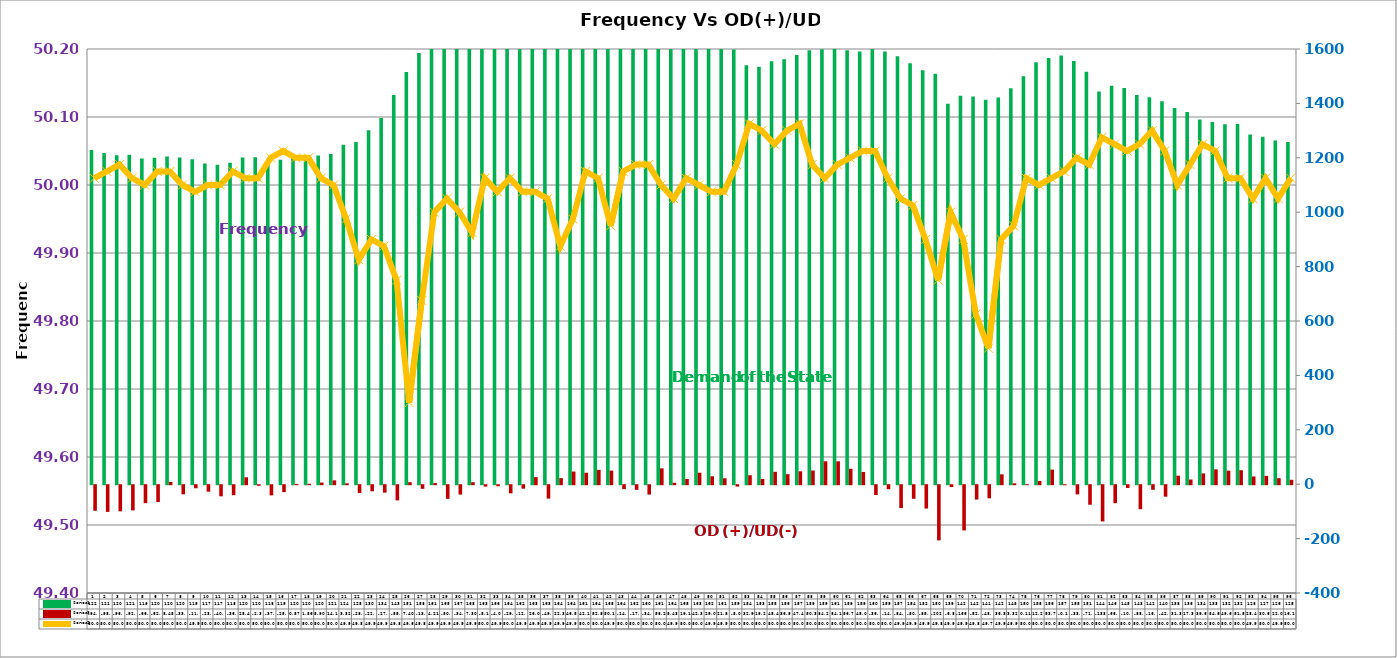
| Category | Series 2 | Series 4 |
|---|---|---|
| 0 | 1229 | -94.1 |
| 1 | 1218 | -98.186 |
| 2 | 1209 | -96.105 |
| 3 | 1211 | -92.636 |
| 4 | 1197 | -66.064 |
| 5 | 1200 | -62.064 |
| 6 | 1205 | 8.455 |
| 7 | 1201 | -33.539 |
| 8 | 1195 | -11.292 |
| 9 | 1179 | -23.832 |
| 10 | 1174 | -40.916 |
| 11 | 1182 | -36.818 |
| 12 | 1201 | 25.466 |
| 13 | 1202 | -2.37 |
| 14 | 1182 | -37.431 |
| 15 | 1193 | -25.498 |
| 16 | 1205 | 0.566 |
| 17 | 1205 | 1.564 |
| 18 | 1208 | 5.903 |
| 19 | 1214 | 14.142 |
| 20 | 1248 | 3.324 |
| 21 | 1258 | -28.539 |
| 22 | 1301 | -22.449 |
| 23 | 1346 | -27.353 |
| 24 | 1431 | -55.811 |
| 25 | 1515 | 7.398 |
| 26 | 1585 | -13.364 |
| 27 | 1611 | 4.207 |
| 28 | 1654 | -50.087 |
| 29 | 1676 | -34.387 |
| 30 | 1686 | 7.3 |
| 31 | 1636 | -5.135 |
| 32 | 1660 | -4.091 |
| 33 | 1640 | -29.851 |
| 34 | 1629 | -12.817 |
| 35 | 1635 | 26.045 |
| 36 | 1637 | -49.322 |
| 37 | 1643 | 22.345 |
| 38 | 1644 | 46.582 |
| 39 | 1614 | 42.102 |
| 40 | 1648 | 52.81 |
| 41 | 1652 | 50.134 |
| 42 | 1645 | -14.563 |
| 43 | 1626 | -17.113 |
| 44 | 1604 | -34.473 |
| 45 | 1614 | 58.236 |
| 46 | 1640 | 5.429 |
| 47 | 1656 | 19.168 |
| 48 | 1634 | 42.308 |
| 49 | 1622 | 29.094 |
| 50 | 1616 | 21.832 |
| 51 | 1598 | -5.088 |
| 52 | 1540 | 32.977 |
| 53 | 1535 | 19.197 |
| 54 | 1555 | 45.446 |
| 55 | 1562 | 36.896 |
| 56 | 1578 | 47.488 |
| 57 | 1595 | 50.362 |
| 58 | 1599 | 84.277 |
| 59 | 1610 | 84.122 |
| 60 | 1595 | 56.744 |
| 61 | 1591 | 45.044 |
| 62 | 1605 | -36.038 |
| 63 | 1591 | -14.833 |
| 64 | 1573 | -84.076 |
| 65 | 1548 | -50.126 |
| 66 | 1522 | -85.839 |
| 67 | 1509 | -202.884 |
| 68 | 1399 | -6.893 |
| 69 | 1428 | -166.306 |
| 70 | 1425 | -52.812 |
| 71 | 1413 | -48.299 |
| 72 | 1422 | 36.331 |
| 73 | 1456 | 3.319 |
| 74 | 1500 | 0.107 |
| 75 | 1551 | 12.205 |
| 76 | 1567 | 53.746 |
| 77 | 1576 | -0.169 |
| 78 | 1556 | -33.849 |
| 79 | 1516 | -71.849 |
| 80 | 1444 | -133.189 |
| 81 | 1465 | -66.189 |
| 82 | 1457 | -10.229 |
| 83 | 1431 | -88.314 |
| 84 | 1423 | -16.94 |
| 85 | 1408 | -42.238 |
| 86 | 1383 | 31.372 |
| 87 | 1368 | 17.372 |
| 88 | 1341 | 39.647 |
| 89 | 1332 | 54.647 |
| 90 | 1323 | 49.671 |
| 91 | 1324 | 51.508 |
| 92 | 1286 | 28.431 |
| 93 | 1277 | 30.655 |
| 94 | 1264 | 22.089 |
| 95 | 1258 | 16.155 |